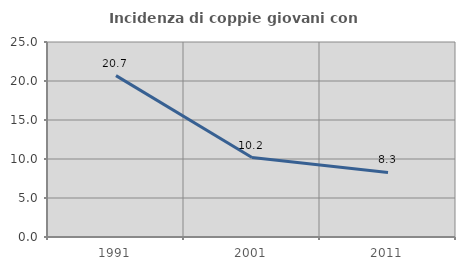
| Category | Incidenza di coppie giovani con figli |
|---|---|
| 1991.0 | 20.69 |
| 2001.0 | 10.182 |
| 2011.0 | 8.276 |